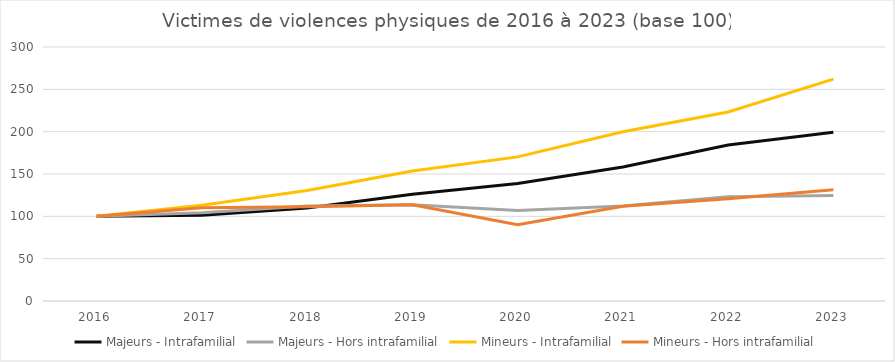
| Category | Majeurs - Intrafamilial | Majeurs - Hors intrafamilial | Mineurs - Intrafamilial | Mineurs - Hors intrafamilial |
|---|---|---|---|---|
| 2016.0 | 100 | 100 | 100 | 100 |
| 2017.0 | 101.235 | 104.188 | 113.167 | 110.187 |
| 2018.0 | 109.809 | 112.283 | 130.521 | 111.436 |
| 2019.0 | 126 | 113.667 | 153.487 | 113.771 |
| 2020.0 | 138.848 | 106.765 | 170.213 | 90.173 |
| 2021.0 | 158.215 | 112.269 | 199.863 | 112.01 |
| 2022.0 | 184.352 | 123.232 | 223.188 | 120.634 |
| 2023.0 | 199.427 | 124.622 | 262.136 | 131.518 |